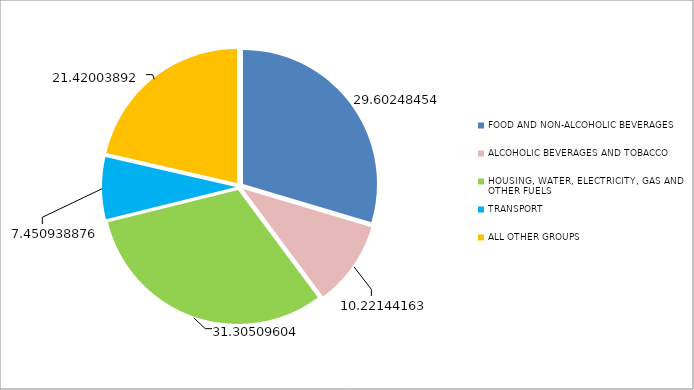
| Category | Series 0 |
|---|---|
| FOOD AND NON-ALCOHOLIC BEVERAGES  | 29.602 |
| ALCOHOLIC BEVERAGES AND TOBACCO | 10.221 |
| HOUSING, WATER, ELECTRICITY, GAS AND OTHER FUELS | 31.305 |
| TRANSPORT | 7.451 |
| ALL OTHER GROUPS | 21.42 |